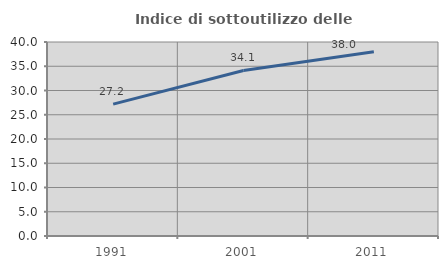
| Category | Indice di sottoutilizzo delle abitazioni  |
|---|---|
| 1991.0 | 27.19 |
| 2001.0 | 34.136 |
| 2011.0 | 37.984 |